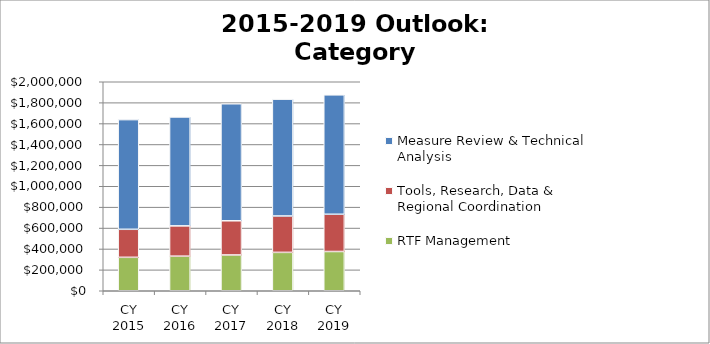
| Category | RTF Management | Tools, Research, Data & Regional Coordination | Measure Review & Technical Analysis |
|---|---|---|---|
| CY 2015 | 320100 | 268000 | 1049500 |
| CY 2016 | 330900 | 290100 | 1042100 |
| CY 2017 | 342700 | 326900 | 1120000 |
| CY 2018 | 367300 | 348400 | 1118000 |
| CY 2019 | 375700 | 356300 | 1142700 |